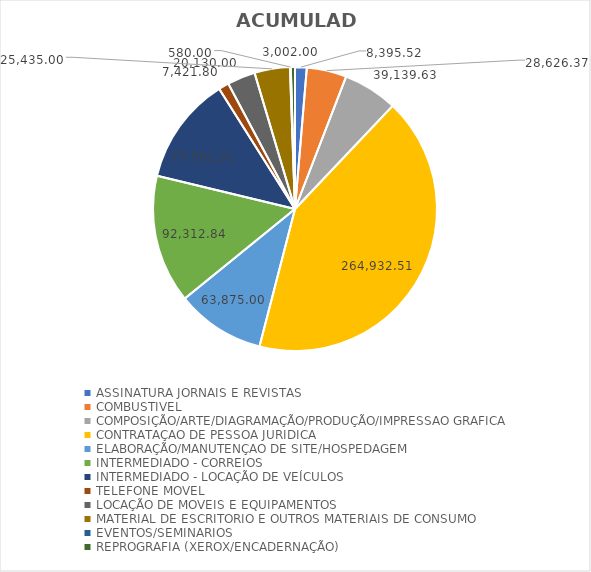
| Category | ACUMULADO |
|---|---|
| ASSINATURA JORNAIS E REVISTAS | 8395.52 |
| COMBUSTIVEL | 28626.37 |
| COMPOSIÇÃO/ARTE/DIAGRAMAÇÃO/PRODUÇÃO/IMPRESSAO GRAFICA | 39139.63 |
| CONTRATAÇAO DE PESSOA JURIDICA | 264932.51 |
| ELABORAÇÃO/MANUTENÇAO DE SITE/HOSPEDAGEM | 63875 |
| INTERMEDIADO - CORREIOS | 92312.84 |
| INTERMEDIADO - LOCAÇÃO DE VEÍCULOS | 77501.31 |
| TELEFONE MOVEL | 7421.8 |
| LOCAÇÃO DE MOVEIS E EQUIPAMENTOS | 20130 |
| MATERIAL DE ESCRITORIO E OUTROS MATERIAIS DE CONSUMO | 25435 |
| EVENTOS/SEMINARIOS | 580 |
| REPROGRAFIA (XEROX/ENCADERNAÇÃO) | 3002 |